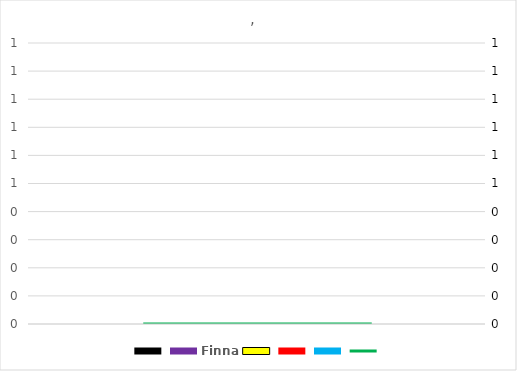
| Category | Series 0 | Finna | Series 2 | Series 3 | Series 4 |
|---|---|---|---|---|---|
| 0 | 0 | 0 | 0 | 0 | 0 |
| 1 | 0 | 0 | 0 | 0 | 0 |